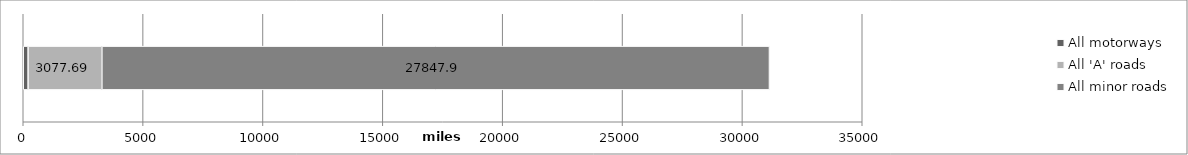
| Category | All motorways | All 'A' roads | All minor roads |
|---|---|---|---|
| South West | 203.07 | 3077.69 | 27847.9 |